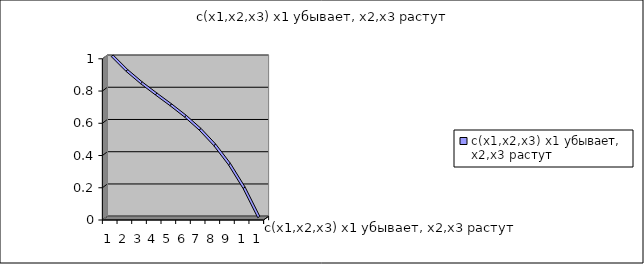
| Category | c(x1,x2,x3) x1 убывает, x2,x3 растут |
|---|---|
| 0 | 1 |
| 1 | 0.909 |
| 2 | 0.832 |
| 3 | 0.763 |
| 4 | 0.696 |
| 5 | 0.625 |
| 6 | 0.544 |
| 7 | 0.447 |
| 8 | 0.328 |
| 9 | 0.181 |
| 10 | 0 |